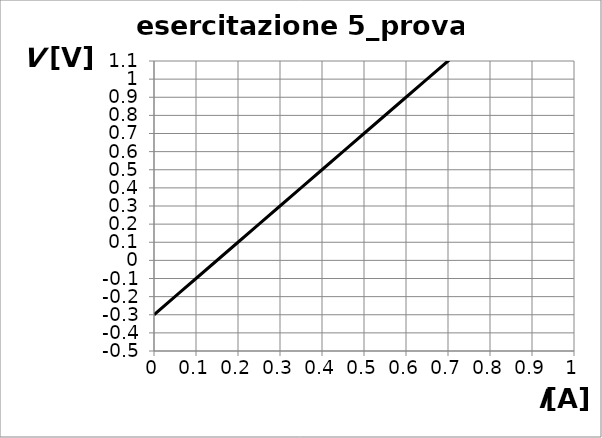
| Category | Series 0 |
|---|---|
| 0.0 | -0.3 |
| 0.1 | -0.1 |
| 0.2 | 0.1 |
| 0.30000000000000004 | 0.3 |
| 0.4 | 0.5 |
| 0.5 | 0.7 |
| 0.6 | 0.9 |
| 0.7 | 1.1 |
| 0.7999999999999999 | 1.3 |
| 0.8999999999999999 | 1.5 |
| 0.9999999999999999 | 1.7 |